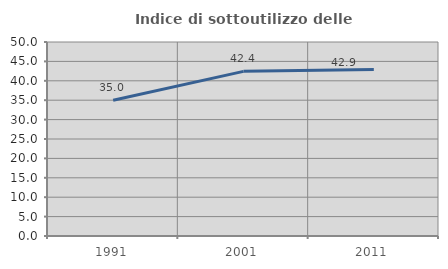
| Category | Indice di sottoutilizzo delle abitazioni  |
|---|---|
| 1991.0 | 34.982 |
| 2001.0 | 42.434 |
| 2011.0 | 42.885 |